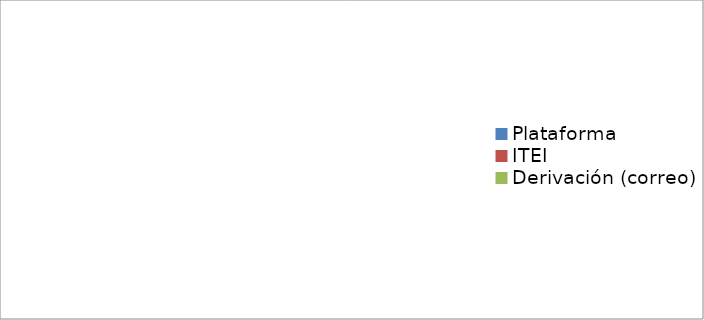
| Category | Series 0 | Series 1 |
|---|---|---|
| Plataforma | 0 | 0 |
| ITEI | 0 | 0 |
| Derivación (correo) | 0 | 0 |